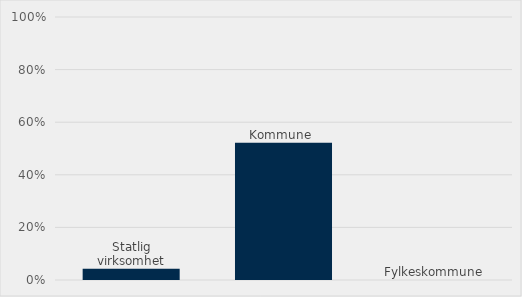
| Category | Estimert verdi som har miljømerke som tildelingskriterium (%) |
|---|---|
| Statlig virksomhet | 0.042 |
| Kommune  | 0.522 |
| Fylkeskommune | 0 |